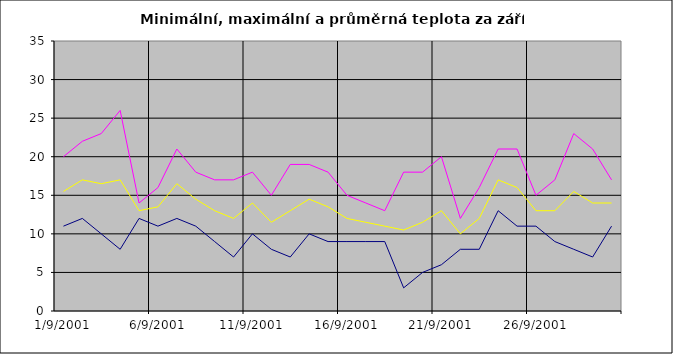
| Category | Series 0 | Series 1 | Series 2 |
|---|---|---|---|
| 2001-09-01 | 11 | 20 | 15.5 |
| 2001-09-02 | 12 | 22 | 17 |
| 2001-09-03 | 10 | 23 | 16.5 |
| 2001-09-04 | 8 | 26 | 17 |
| 2001-09-05 | 12 | 14 | 13 |
| 2001-09-06 | 11 | 16 | 13.5 |
| 2001-09-07 | 12 | 21 | 16.5 |
| 2001-09-08 | 11 | 18 | 14.5 |
| 2001-09-09 | 9 | 17 | 13 |
| 2001-09-10 | 7 | 17 | 12 |
| 2001-09-11 | 10 | 18 | 14 |
| 2001-09-12 | 8 | 15 | 11.5 |
| 2001-09-13 | 7 | 19 | 13 |
| 2001-09-14 | 10 | 19 | 14.5 |
| 2001-09-15 | 9 | 18 | 13.5 |
| 2001-09-16 | 9 | 15 | 12 |
| 2001-09-17 | 9 | 14 | 11.5 |
| 2001-09-18 | 9 | 13 | 11 |
| 2001-09-19 | 3 | 18 | 10.5 |
| 2001-09-20 | 5 | 18 | 11.5 |
| 2001-09-21 | 6 | 20 | 13 |
| 2001-09-22 | 8 | 12 | 10 |
| 2001-09-23 | 8 | 16 | 12 |
| 2001-09-24 | 13 | 21 | 17 |
| 2001-09-25 | 11 | 21 | 16 |
| 2001-09-26 | 11 | 15 | 13 |
| 2001-09-27 | 9 | 17 | 13 |
| 2001-09-28 | 8 | 23 | 15.5 |
| 2001-09-29 | 7 | 21 | 14 |
| 2001-09-30 | 11 | 17 | 14 |